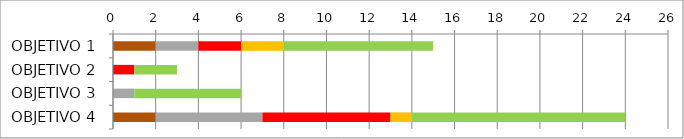
| Category | Series 0 | Series 1 | Series 2 | Series 3 | Series 4 | Series 5 |
|---|---|---|---|---|---|---|
| OBJETIVO 1 | 2 | 2 | 2 | 2 | 7 | 0 |
| OBJETIVO 2 | 0 | 0 | 1 | 0 | 2 | 0 |
| OBJETIVO 3 | 0 | 1 | 0 | 0 | 5 | 0 |
| OBJETIVO 4 | 2 | 5 | 6 | 1 | 10 | 0 |